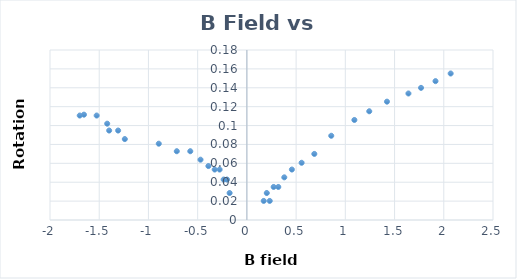
| Category | Series 0 |
|---|---|
| -0.1755 | 0.029 |
| -0.202 | 0.043 |
| -0.236 | 0.043 |
| -0.277 | 0.053 |
| -0.327 | 0.053 |
| -0.391 | 0.057 |
| -0.471 | 0.064 |
| -0.575 | 0.073 |
| -0.712 | 0.073 |
| -0.895 | 0.081 |
| -1.24 | 0.086 |
| -1.308 | 0.095 |
| -1.399 | 0.095 |
| -1.419 | 0.102 |
| -1.526 | 0.111 |
| -1.655 | 0.112 |
| -1.698 | 0.111 |
| 0.1711 | 0.02 |
| 0.202 | 0.029 |
| 0.232 | 0.02 |
| 0.272 | 0.035 |
| 0.319 | 0.035 |
| 0.38 | 0.045 |
| 0.457 | 0.053 |
| 0.556 | 0.061 |
| 0.685 | 0.07 |
| 0.857 | 0.089 |
| 1.092 | 0.106 |
| 1.243 | 0.115 |
| 1.423 | 0.125 |
| 1.641 | 0.134 |
| 1.769 | 0.14 |
| 1.916 | 0.147 |
| 2.07 | 0.155 |